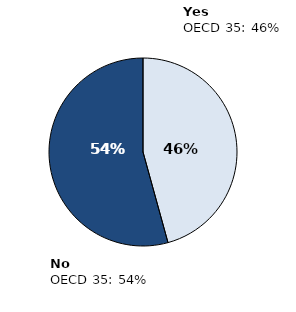
| Category | OECD35 |
|---|---|
| Yes | 0.457 |
| No | 0.543 |